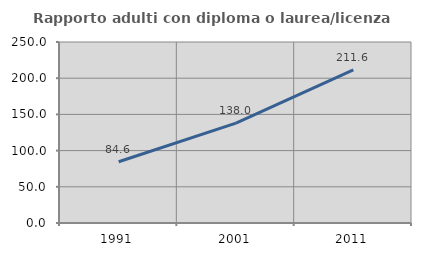
| Category | Rapporto adulti con diploma o laurea/licenza media  |
|---|---|
| 1991.0 | 84.593 |
| 2001.0 | 138.038 |
| 2011.0 | 211.594 |